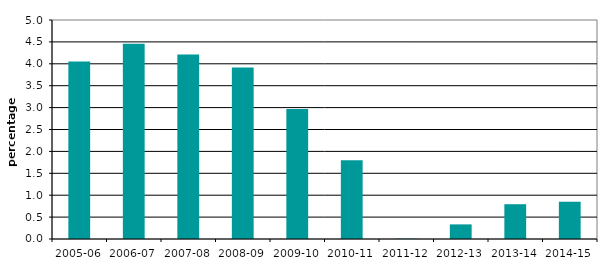
| Category | Series 2 |
|---|---|
| 2005-06 | 4.05 |
| 2006-07 | 4.457 |
| 2007-08 | 4.212 |
| 2008-09 | 3.917 |
| 2009-10 | 2.969 |
| 2010-11 | 1.795 |
| 2011-12 | 0.008 |
| 2012-13 | 0.333 |
| 2013-14 | 0.794 |
| 2014-15 | 0.851 |